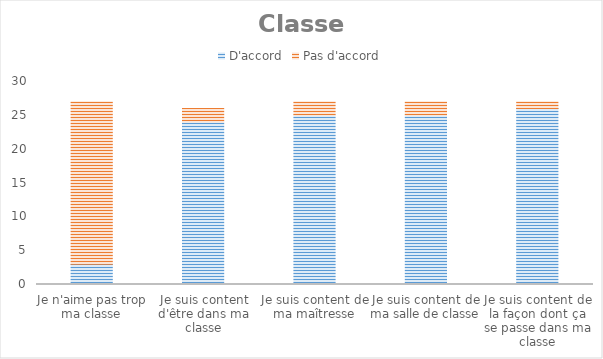
| Category | D'accord | Pas d'accord |
|---|---|---|
| Je n'aime pas trop ma classe | 3 | 24 |
| Je suis content d'être dans ma classe | 24 | 2 |
| Je suis content de ma maîtresse | 25 | 2 |
| Je suis content de ma salle de classe | 25 | 2 |
| Je suis content de la façon dont ça se passe dans ma classe | 26 | 1 |